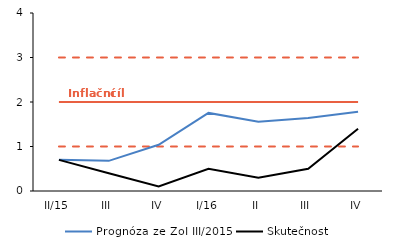
| Category | Series 3 | Series 2 | Series 7 | Prognóza ze ZoI III/2015 | Skutečnost |
|---|---|---|---|---|---|
| II/15 | 2 | 1 | 3 | 0.7 | 0.7 |
| III | 2 | 1 | 3 | 0.678 | 0.4 |
| IV | 2 | 1 | 3 | 1.039 | 0.1 |
| I/16 | 2 | 1 | 3 | 1.755 | 0.5 |
| II | 2 | 1 | 3 | 1.554 | 0.3 |
| III | 2 | 1 | 3 | 1.643 | 0.5 |
| IV | 2 | 1 | 3 | 1.782 | 1.4 |